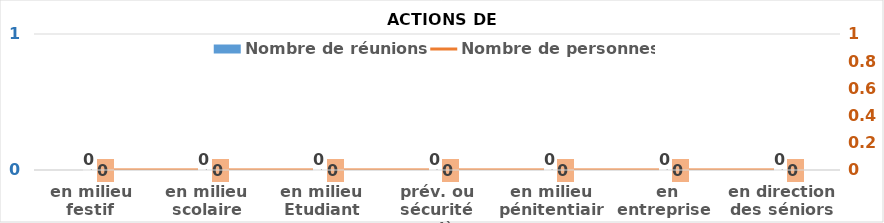
| Category | Nombre de réunions |
|---|---|
| en milieu festif  | 0 |
| en milieu scolaire | 0 |
| en milieu Etudiant | 0 |
| prév. ou sécurité routière | 0 |
| en milieu pénitentiaire | 0 |
| en entreprise  | 0 |
| en direction des séniors | 0 |